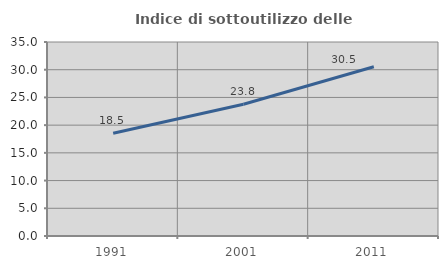
| Category | Indice di sottoutilizzo delle abitazioni  |
|---|---|
| 1991.0 | 18.55 |
| 2001.0 | 23.777 |
| 2011.0 | 30.546 |